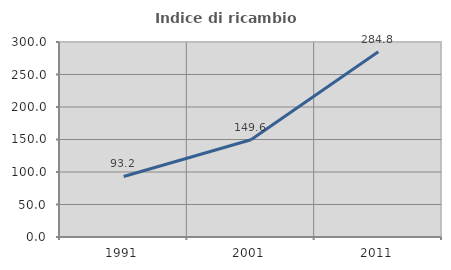
| Category | Indice di ricambio occupazionale  |
|---|---|
| 1991.0 | 93.162 |
| 2001.0 | 149.593 |
| 2011.0 | 284.848 |